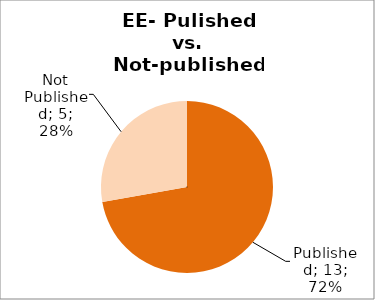
| Category | Series 0 |
|---|---|
| Published | 13 |
| Not Published | 5 |